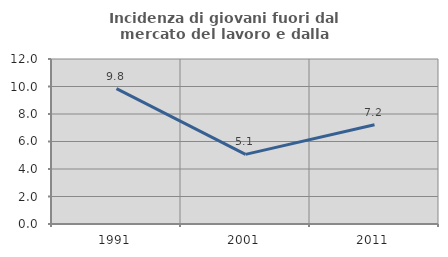
| Category | Incidenza di giovani fuori dal mercato del lavoro e dalla formazione  |
|---|---|
| 1991.0 | 9.847 |
| 2001.0 | 5.063 |
| 2011.0 | 7.219 |